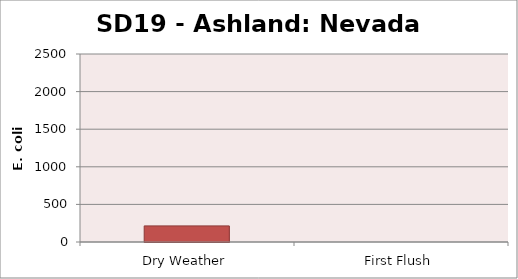
| Category | E. coli MPN |
|---|---|
| Dry Weather | 214.2 |
| First Flush | 0 |